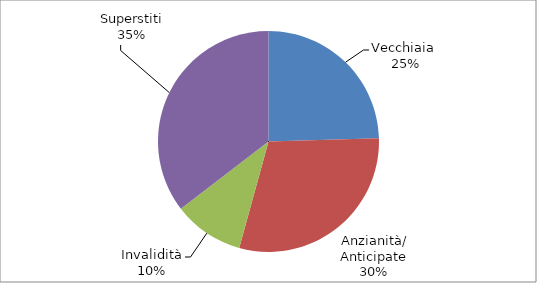
| Category | Series 0 |
|---|---|
| Vecchiaia  | 10409 |
| Anzianità/ Anticipate | 12609 |
| Invalidità | 4373 |
| Superstiti | 15023 |